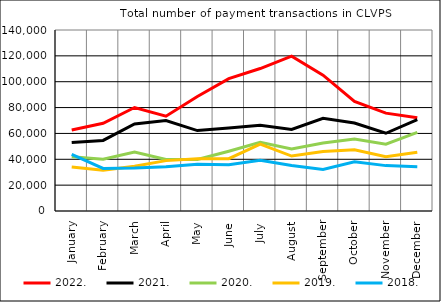
| Category | 2022. | 2021. | 2020. | 2019. | 2018. |
|---|---|---|---|---|---|
| January | 62721 | 52920 | 41895 | 34043 | 43740 |
| February | 67834 | 54604 | 40110 | 31600 | 32897 |
| March | 80050 | 67292 | 45611 | 34667 | 33232 |
| April | 73356 | 69996 | 39897 | 38963 | 34311 |
| May | 88536 | 62208 | 39808 | 40344 | 36156 |
| June | 102343 | 64153 | 46236 | 40472 | 35742 |
| July | 110191 | 66371 | 53059 | 51806 | 39184 |
| August | 119751 | 63069 | 47894 | 42516 | 35142 |
| September | 105076 | 71734 | 52640 | 46060 | 32058 |
| October | 84749 | 68039 | 55705 | 47355 | 38001 |
| November | 75679 | 60129 | 51612 | 41972 | 35099 |
| December | 72083 | 70661 | 60813 | 45440 | 34285 |